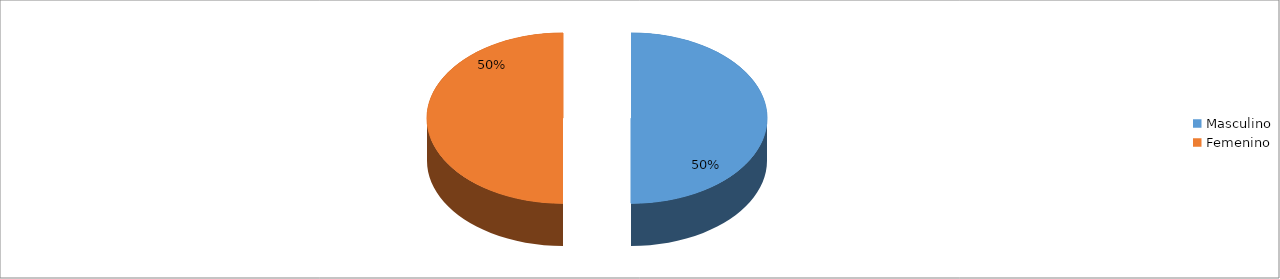
| Category | Series 0 |
|---|---|
| Masculino | 0.5 |
| Femenino | 0.5 |